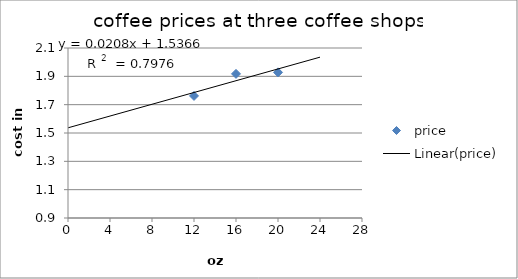
| Category | price |
|---|---|
| 12.0 | 1.762 |
| 16.0 | 1.917 |
| 20.0 | 1.928 |